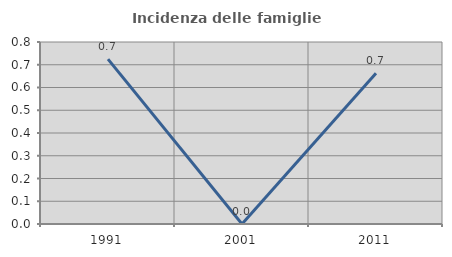
| Category | Incidenza delle famiglie numerose |
|---|---|
| 1991.0 | 0.725 |
| 2001.0 | 0 |
| 2011.0 | 0.662 |